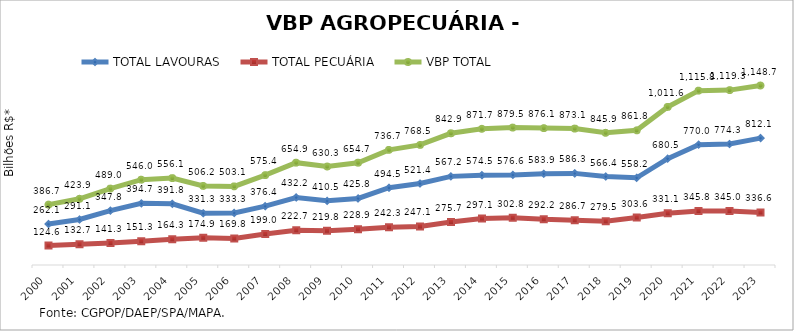
| Category | TOTAL LAVOURAS | TOTAL PECUÁRIA | VBP TOTAL |
|---|---|---|---|
| 2000 | 262.088 | 124.563 | 386.651 |
| 2001 | 291.131 | 132.73 | 423.862 |
| 2002 | 347.766 | 141.283 | 489.05 |
| 2003 | 394.712 | 151.333 | 546.046 |
| 2004 | 391.822 | 164.278 | 556.101 |
| 2005 | 331.268 | 174.925 | 506.193 |
| 2006 | 333.292 | 169.811 | 503.103 |
| 2007 | 376.392 | 198.982 | 575.375 |
| 2008 | 432.191 | 222.722 | 654.913 |
| 2009 | 410.525 | 219.762 | 630.287 |
| 2010 | 425.759 | 228.924 | 654.684 |
| 2011 | 494.467 | 242.277 | 736.744 |
| 2012 | 521.355 | 247.107 | 768.463 |
| 2013 | 567.238 | 275.664 | 842.902 |
| 2014 | 574.536 | 297.133 | 871.669 |
| 2015 | 576.621 | 302.842 | 879.462 |
| 2016 | 583.912 | 292.211 | 876.123 |
| 2017 | 586.336 | 286.737 | 873.073 |
| 2018 | 566.368 | 279.546 | 845.914 |
| 2019 | 558.223 | 303.565 | 861.789 |
| 2020 | 680.487 | 331.083 | 1011.571 |
| 2021 | 769.988 | 345.822 | 1115.81 |
| 2022 | 774.326 | 344.998 | 1119.324 |
| 2023 | 812.101 | 336.598 | 1148.699 |